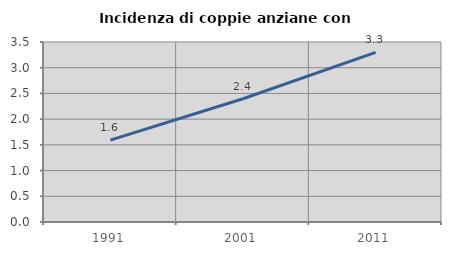
| Category | Incidenza di coppie anziane con figli |
|---|---|
| 1991.0 | 1.593 |
| 2001.0 | 2.397 |
| 2011.0 | 3.297 |